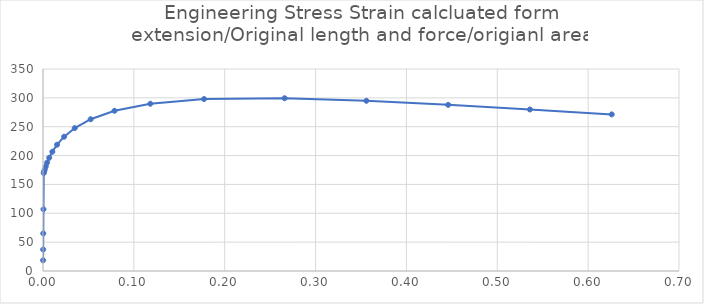
| Category | Series 0 |
|---|---|
| 9e-05 | 18.609 |
| 0.00018 | 37.215 |
| 0.000315 | 65.116 |
| 0.0005175 | 106.953 |
| 0.00082125 | 169.675 |
| 0.00127688 | 172.338 |
| 0.00196031 | 175.974 |
| 0.00298547 | 181.083 |
| 0.0045232 | 187.737 |
| 0.0068298 | 196.153 |
| 0.0102897 | 206.638 |
| 0.0154796 | 218.831 |
| 0.0232643 | 232.7 |
| 0.0349415 | 247.613 |
| 0.0524573 | 262.933 |
| 0.0787309 | 277.598 |
| 0.118141 | 289.809 |
| 0.177257 | 297.937 |
| 0.265931 | 299.357 |
| 0.355931 | 294.942 |
| 0.445931 | 287.881 |
| 0.535931 | 279.839 |
| 0.625931 | 271.334 |